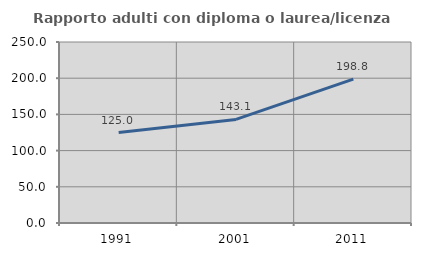
| Category | Rapporto adulti con diploma o laurea/licenza media  |
|---|---|
| 1991.0 | 125 |
| 2001.0 | 143.059 |
| 2011.0 | 198.802 |